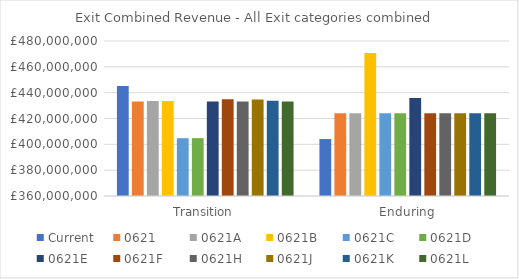
| Category | Current | 0621 | 0621A | 0621B | 0621C | 0621D | 0621E | 0621F | 0621H | 0621J | 0621K | 0621L |
|---|---|---|---|---|---|---|---|---|---|---|---|---|
| Transition | 445215636.201 | 433124398.611 | 433595707.155 | 433595707.155 | 404728263.365 | 404781881.745 | 433124398.611 | 434872985.866 | 433124398.611 | 434771985.053 | 433690026.668 | 433124398.611 |
| Enduring | 404091760.527 | 423999000 | 423999000 | 470760363.109 | 423999000 | 423999000 | 435793695.482 | 423999000 | 423999000 | 423999000 | 423999000 | 423999000 |